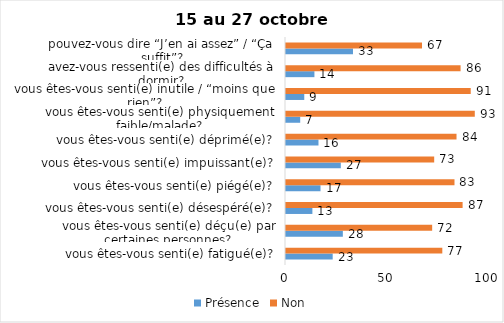
| Category | Présence | Non |
|---|---|---|
| vous êtes-vous senti(e) fatigué(e)? | 23 | 77 |
| vous êtes-vous senti(e) déçu(e) par certaines personnes? | 28 | 72 |
| vous êtes-vous senti(e) désespéré(e)? | 13 | 87 |
| vous êtes-vous senti(e) piégé(e)? | 17 | 83 |
| vous êtes-vous senti(e) impuissant(e)? | 27 | 73 |
| vous êtes-vous senti(e) déprimé(e)? | 16 | 84 |
| vous êtes-vous senti(e) physiquement faible/malade? | 7 | 93 |
| vous êtes-vous senti(e) inutile / “moins que rien”? | 9 | 91 |
| avez-vous ressenti(e) des difficultés à dormir? | 14 | 86 |
| pouvez-vous dire “J’en ai assez” / “Ça suffit”? | 33 | 67 |